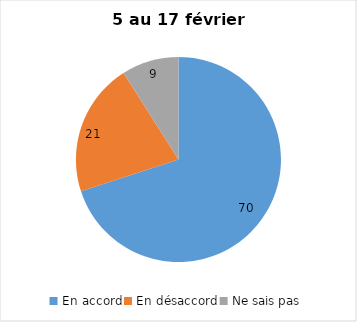
| Category | Series 0 |
|---|---|
| En accord | 70 |
| En désaccord | 21 |
| Ne sais pas | 9 |